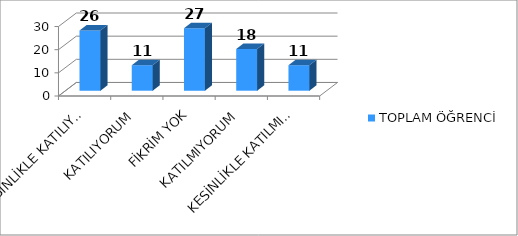
| Category | TOPLAM ÖĞRENCİ |
|---|---|
| KESİNLİKLE KATILIYORUM | 26 |
| KATILIYORUM | 11 |
| FİKRİM YOK | 27 |
| KATILMIYORUM | 18 |
| KESİNLİKLE KATILMIYORUM | 11 |